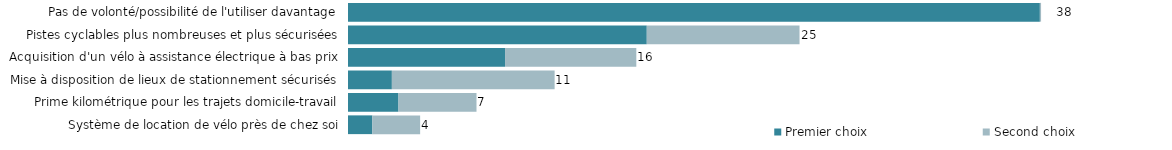
| Category | Premier choix | Second choix |
|---|---|---|
| Système de location de vélo près de chez soi | 41.935 | 82.277 |
| Prime kilométrique pour les trajets domicile-travail | 86.901 | 134.365 |
| Mise à disposition de lieux de stationnement sécurisés | 75.543 | 280.27 |
| Acquisition d'un vélo à assistance électrique à bas prix | 270.454 | 226.02 |
| Pistes cyclables plus nombreuses et plus sécurisées | 514.503 | 263.048 |
| Pas de volonté/possibilité de l'utiliser davantage | 1191.401 | 2.065 |